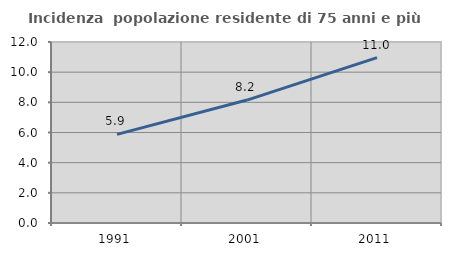
| Category | Incidenza  popolazione residente di 75 anni e più |
|---|---|
| 1991.0 | 5.874 |
| 2001.0 | 8.151 |
| 2011.0 | 10.965 |